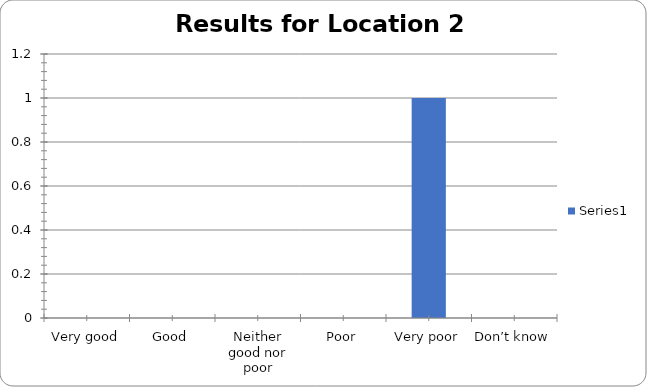
| Category | Series 0 |
|---|---|
| Very good | 0 |
| Good | 0 |
| Neither good nor poor | 0 |
| Poor | 0 |
| Very poor | 1 |
| Don’t know | 0 |